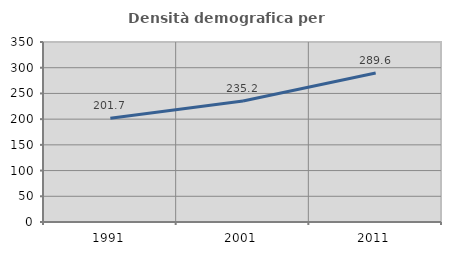
| Category | Densità demografica |
|---|---|
| 1991.0 | 201.734 |
| 2001.0 | 235.225 |
| 2011.0 | 289.574 |